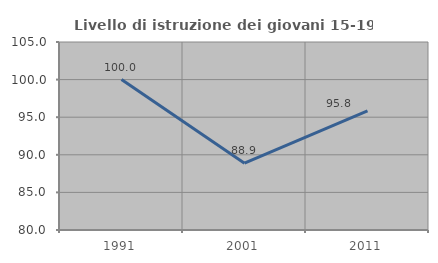
| Category | Livello di istruzione dei giovani 15-19 anni |
|---|---|
| 1991.0 | 100 |
| 2001.0 | 88.889 |
| 2011.0 | 95.833 |